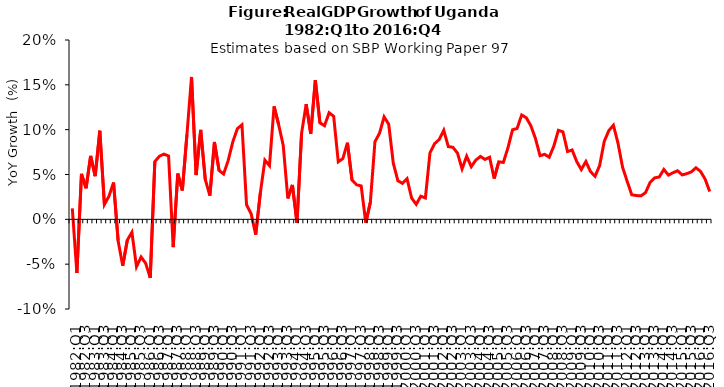
| Category | Series 0 |
|---|---|
| 1982:Q1 | 0.012 |
| 1982:Q2 | -0.06 |
| 1982:Q3 | 0.051 |
| 1982:Q4 | 0.035 |
| 1983:Q1 | 0.071 |
| 1983:Q2 | 0.048 |
| 1983:Q3 | 0.099 |
| 1983:Q4 | 0.017 |
| 1984:Q1 | 0.026 |
| 1984:Q2 | 0.041 |
| 1984:Q3 | -0.024 |
| 1984:Q4 | -0.052 |
| 1985:Q1 | -0.023 |
| 1985:Q2 | -0.014 |
| 1985:Q3 | -0.053 |
| 1985:Q4 | -0.042 |
| 1986:Q1 | -0.049 |
| 1986:Q2 | -0.065 |
| 1986:Q3 | 0.064 |
| 1986:Q4 | 0.07 |
| 1987:Q1 | 0.073 |
| 1987:Q2 | 0.071 |
| 1987:Q3 | -0.031 |
| 1987:Q4 | 0.051 |
| 1988:Q1 | 0.032 |
| 1988:Q2 | 0.095 |
| 1988:Q3 | 0.159 |
| 1988:Q4 | 0.049 |
| 1989:Q1 | 0.1 |
| 1989:Q2 | 0.044 |
| 1989:Q3 | 0.027 |
| 1989:Q4 | 0.086 |
| 1990:Q1 | 0.055 |
| 1990:Q2 | 0.051 |
| 1990:Q3 | 0.066 |
| 1990:Q4 | 0.086 |
| 1991:Q1 | 0.101 |
| 1991:Q2 | 0.105 |
| 1991:Q3 | 0.016 |
| 1991:Q4 | 0.006 |
| 1992:Q1 | -0.017 |
| 1992:Q2 | 0.029 |
| 1992:Q3 | 0.066 |
| 1992:Q4 | 0.06 |
| 1993:Q1 | 0.126 |
| 1993:Q2 | 0.106 |
| 1993:Q3 | 0.082 |
| 1993:Q4 | 0.023 |
| 1994:Q1 | 0.038 |
| 1994:Q2 | -0.004 |
| 1994:Q3 | 0.096 |
| 1994:Q4 | 0.128 |
| 1995:Q1 | 0.095 |
| 1995:Q2 | 0.155 |
| 1995:Q3 | 0.108 |
| 1995:Q4 | 0.104 |
| 1996:Q1 | 0.119 |
| 1996:Q2 | 0.115 |
| 1996:Q3 | 0.064 |
| 1996:Q4 | 0.068 |
| 1997:Q1 | 0.085 |
| 1997:Q2 | 0.044 |
| 1997:Q3 | 0.039 |
| 1997:Q4 | 0.037 |
| 1998:Q1 | -0.004 |
| 1998:Q2 | 0.019 |
| 1998:Q3 | 0.087 |
| 1998:Q4 | 0.096 |
| 1999:Q1 | 0.114 |
| 1999:Q2 | 0.106 |
| 1999:Q3 | 0.063 |
| 1999:Q4 | 0.043 |
| 2000:Q1 | 0.04 |
| 2000:Q2 | 0.045 |
| 2000:Q3 | 0.024 |
| 2000:Q4 | 0.017 |
| 2001:Q1 | 0.026 |
| 2001:Q2 | 0.024 |
| 2001:Q3 | 0.074 |
| 2001:Q4 | 0.084 |
| 2002:Q1 | 0.089 |
| 2002:Q2 | 0.099 |
| 2002:Q3 | 0.081 |
| 2002:Q4 | 0.08 |
| 2003:Q1 | 0.074 |
| 2003:Q2 | 0.056 |
| 2003:Q3 | 0.07 |
| 2003:Q4 | 0.059 |
| 2004:Q1 | 0.066 |
| 2004:Q2 | 0.07 |
| 2004:Q3 | 0.067 |
| 2004:Q4 | 0.069 |
| 2005:Q1 | 0.045 |
| 2005:Q2 | 0.064 |
| 2005:Q3 | 0.063 |
| 2005:Q4 | 0.08 |
| 2006:Q1 | 0.1 |
| 2006:Q2 | 0.101 |
| 2006:Q3 | 0.116 |
| 2006:Q4 | 0.113 |
| 2007:Q1 | 0.104 |
| 2007:Q2 | 0.09 |
| 2007:Q3 | 0.071 |
| 2007:Q4 | 0.073 |
| 2008:Q1 | 0.069 |
| 2008:Q2 | 0.082 |
| 2008:Q3 | 0.099 |
| 2008:Q4 | 0.098 |
| 2009:Q1 | 0.076 |
| 2009:Q2 | 0.077 |
| 2009:Q3 | 0.064 |
| 2009:Q4 | 0.056 |
| 2010:Q1 | 0.064 |
| 2010:Q2 | 0.053 |
| 2010:Q3 | 0.048 |
| 2010:Q4 | 0.06 |
| 2011:Q1 | 0.087 |
| 2011:Q2 | 0.099 |
| 2011:Q3 | 0.105 |
| 2011:Q4 | 0.085 |
| 2012:Q1 | 0.058 |
| 2012:Q2 | 0.042 |
| 2012:Q3 | 0.027 |
| 2012:Q4 | 0.027 |
| 2013:Q1 | 0.026 |
| 2013:Q2 | 0.03 |
| 2013:Q3 | 0.041 |
| 2013:Q4 | 0.046 |
| 2014:Q1 | 0.047 |
| 2014:Q2 | 0.056 |
| 2014:Q3 | 0.049 |
| 2014:Q4 | 0.052 |
| 2015:Q1 | 0.054 |
| 2015:Q2 | 0.05 |
| 2015:Q3 | 0.051 |
| 2015:Q4 | 0.053 |
| 2016:Q1 | 0.058 |
| 2016:Q2 | 0.053 |
| 2016:Q3 | 0.045 |
| 2016:Q4 | 0.031 |